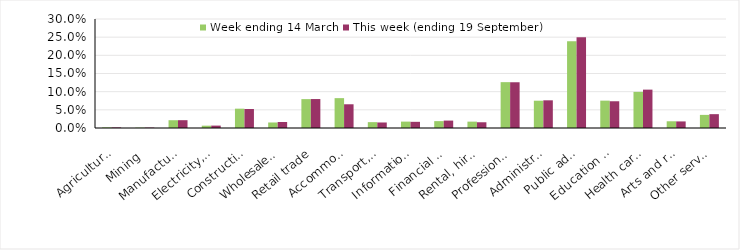
| Category | Week ending 14 March | This week (ending 19 September) |
|---|---|---|
| Agriculture, forestry and fishing | 0.002 | 0.002 |
| Mining | 0.001 | 0.001 |
| Manufacturing | 0.021 | 0.022 |
| Electricity, gas, water and waste services | 0.006 | 0.007 |
| Construction | 0.053 | 0.052 |
| Wholesale trade | 0.015 | 0.016 |
| Retail trade | 0.08 | 0.08 |
| Accommodation and food services | 0.082 | 0.065 |
| Transport, postal and warehousing | 0.016 | 0.015 |
| Information media and telecommunications | 0.018 | 0.017 |
| Financial and insurance services | 0.019 | 0.02 |
| Rental, hiring and real estate services | 0.018 | 0.016 |
| Professional, scientific and technical services | 0.126 | 0.126 |
| Administrative and support services | 0.075 | 0.076 |
| Public administration and safety | 0.239 | 0.25 |
| Education and training | 0.075 | 0.074 |
| Health care and social assistance | 0.099 | 0.106 |
| Arts and recreation services | 0.018 | 0.018 |
| Other services | 0.036 | 0.038 |